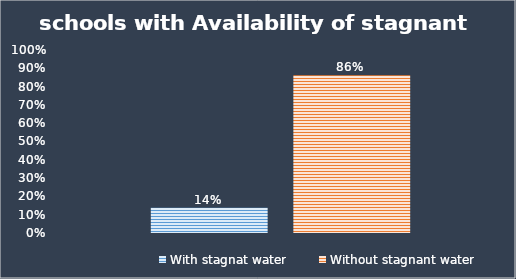
| Category | With stagnat water | Without stagnant water |
|---|---|---|
| 0 | 0.138 | 0.862 |